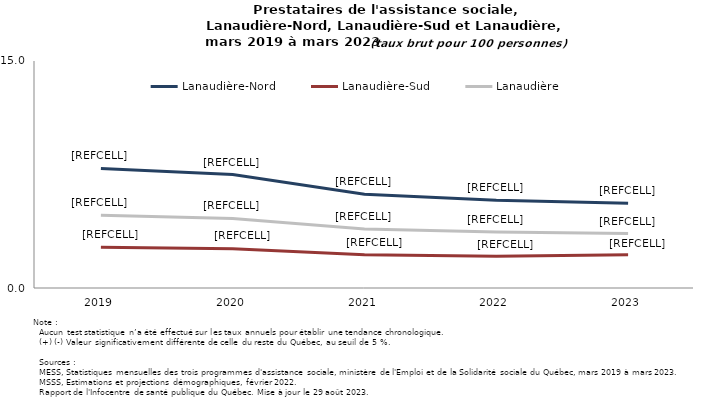
| Category | Lanaudière-Nord | Lanaudière-Sud | Lanaudière |
|---|---|---|---|
| 2019.0 | 7.9 | 2.7 | 4.8 |
| 2020.0 | 7.5 | 2.6 | 4.6 |
| 2021.0 | 6.2 | 2.2 | 3.9 |
| 2022.0 | 5.8 | 2.1 | 3.7 |
| 2023.0 | 5.6 | 2.2 | 3.6 |